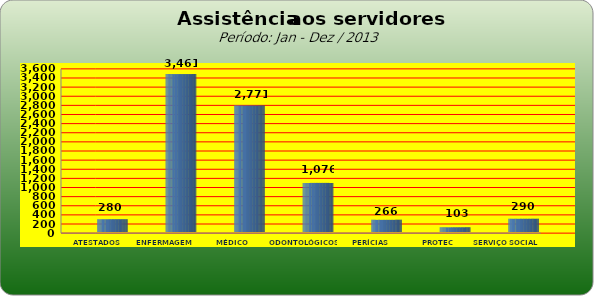
| Category | Series 0 |
|---|---|
| ATESTADOS MÉDICOS | 280 |
| ENFERMAGEM | 3461 |
| MÉDICO | 2771 |
| ODONTOLÓGICOS | 1076 |
| PERÍCIAS MÉDICAS | 266 |
| PROTEC | 103 |
| SERVIÇO SOCIAL | 290 |